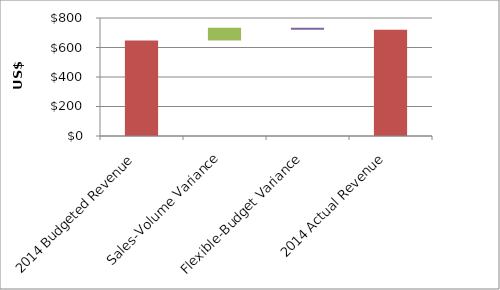
| Category | Series 0 | Series 1 | Series 2 | Series 3 |
|---|---|---|---|---|
| 2014 Budgeted Revenue | 0 | 647700000 | 0 | 0 |
| Sales-Volume Variance | 647700000 | 0 | 85660000 | 0 |
| Flexible-Budget Variance | 719640000 | 0 | 0 | 13720000 |
| 2014 Actual Revenue | 0 | 719640000 | 0 | 0 |